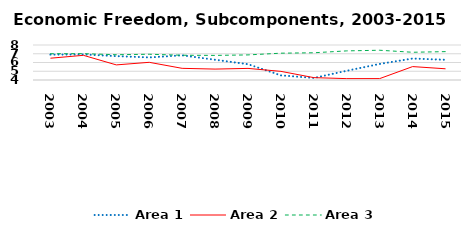
| Category | Area 1 | Area 2 | Area 3 |
|---|---|---|---|
| 2003.0 | 6.899 | 6.491 | 7.001 |
| 2004.0 | 6.923 | 6.821 | 7.01 |
| 2005.0 | 6.729 | 5.726 | 6.888 |
| 2006.0 | 6.578 | 6.02 | 6.942 |
| 2007.0 | 6.82 | 5.333 | 6.83 |
| 2008.0 | 6.315 | 5.247 | 6.811 |
| 2009.0 | 5.807 | 5.327 | 6.867 |
| 2010.0 | 4.527 | 4.987 | 7.065 |
| 2011.0 | 4.234 | 4.271 | 7.112 |
| 2012.0 | 5.056 | 4.157 | 7.327 |
| 2013.0 | 5.835 | 4.16 | 7.4 |
| 2014.0 | 6.455 | 5.533 | 7.17 |
| 2015.0 | 6.308 | 5.282 | 7.243 |